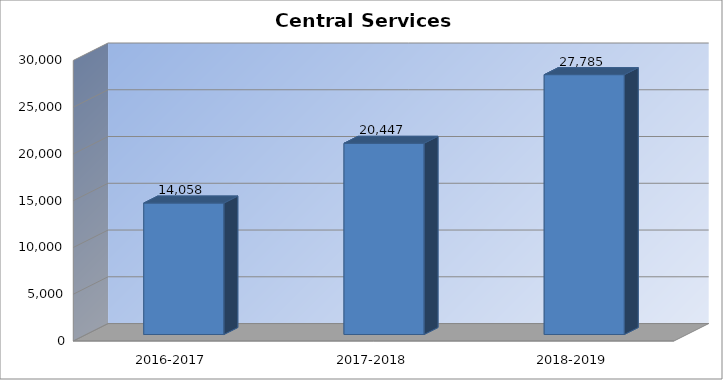
| Category | Central Services |
|---|---|
| 2016-2017 | 14058 |
| 2017-2018 | 20447 |
| 2018-2019 | 27785 |